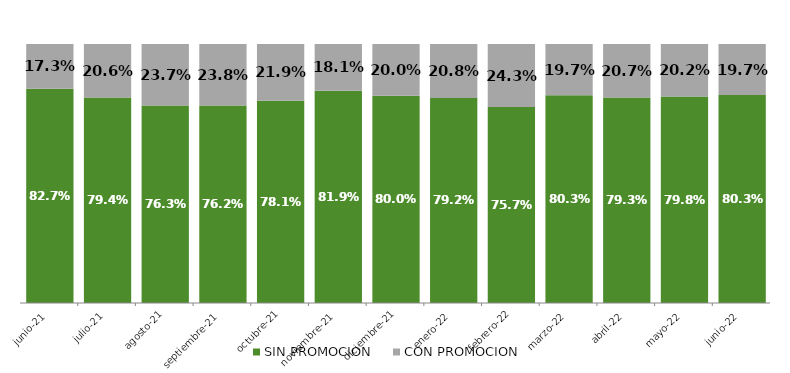
| Category | SIN PROMOCION   | CON PROMOCION   |
|---|---|---|
| 2021-06-01 | 0.827 | 0.173 |
| 2021-07-01 | 0.794 | 0.206 |
| 2021-08-01 | 0.763 | 0.237 |
| 2021-09-01 | 0.762 | 0.238 |
| 2021-10-01 | 0.781 | 0.219 |
| 2021-11-01 | 0.819 | 0.181 |
| 2021-12-01 | 0.8 | 0.2 |
| 2022-01-01 | 0.792 | 0.208 |
| 2022-02-01 | 0.757 | 0.243 |
| 2022-03-01 | 0.803 | 0.197 |
| 2022-04-01 | 0.793 | 0.207 |
| 2022-05-01 | 0.798 | 0.202 |
| 2022-06-01 | 0.803 | 0.197 |